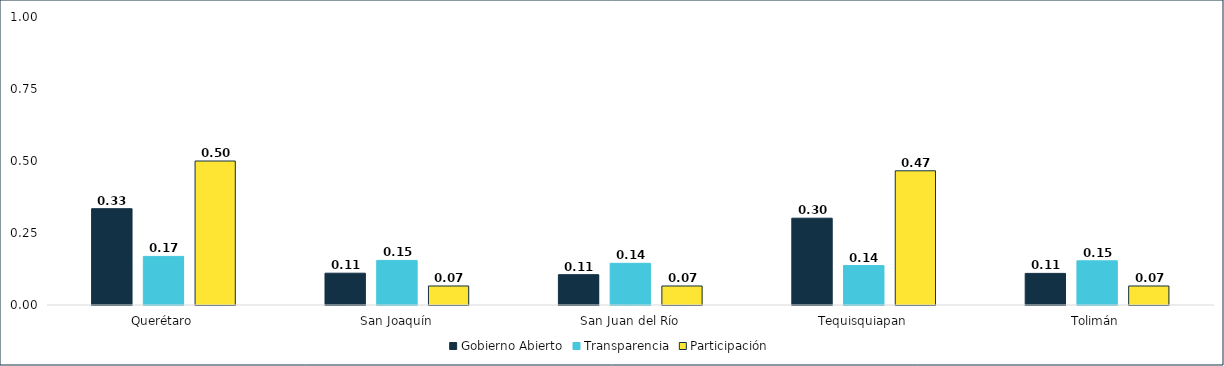
| Category | Gobierno Abierto | Transparencia | Participación |
|---|---|---|---|
| Querétaro | 0.334 | 0.169 | 0.5 |
| San Joaquín | 0.11 | 0.155 | 0.066 |
| San Juan del Río | 0.105 | 0.145 | 0.066 |
| Tequisquiapan | 0.301 | 0.137 | 0.466 |
| Tolimán | 0.11 | 0.153 | 0.066 |